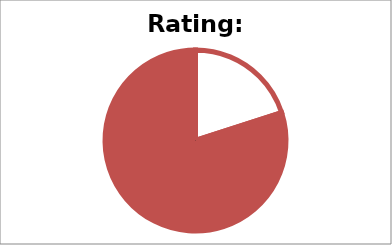
| Category | Series 0 |
|---|---|
| Pie Empty | 0.6 |
| Pie | 2.4 |